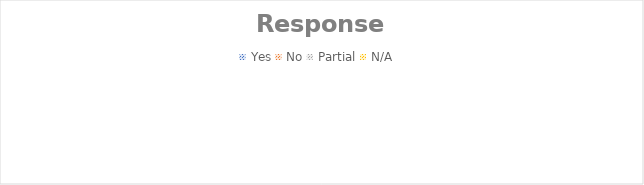
| Category | Series 0 |
|---|---|
| Yes | 0 |
| No | 0 |
| Partial | 0 |
| N/A | 0 |